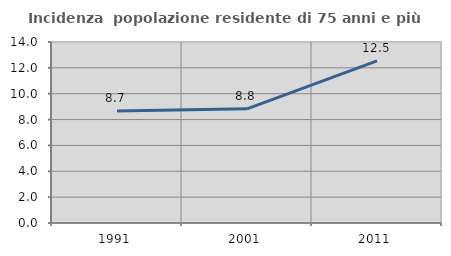
| Category | Incidenza  popolazione residente di 75 anni e più |
|---|---|
| 1991.0 | 8.663 |
| 2001.0 | 8.828 |
| 2011.0 | 12.545 |